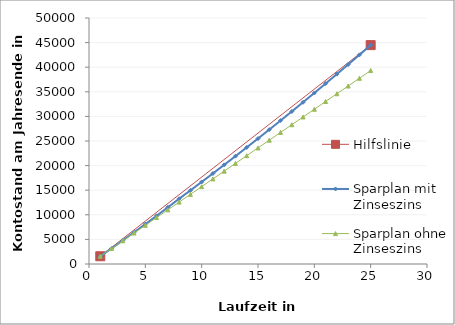
| Category | Hilfslinie |
|---|---|
| 1.0 | 1572.675 |
| 25.0 | 44484.888 |